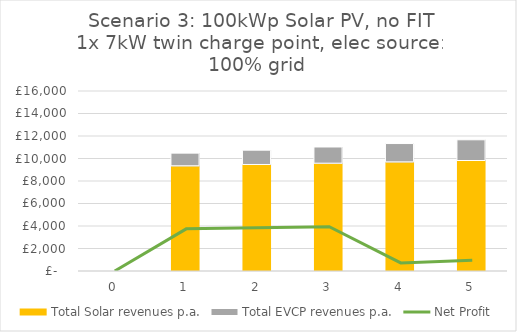
| Category | Total Solar revenues p.a. | Total EVCP revenues p.a. |
|---|---|---|
| 0.0 | 0 | 0 |
| 1.0 | 9310 | 1166.667 |
| 2.0 | 9423.81 | 1315.417 |
| 3.0 | 9539.534 | 1483.132 |
| 4.0 | 9657.197 | 1672.232 |
| 5.0 | 9776.827 | 1885.441 |